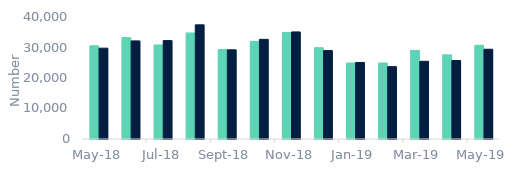
| Category | First-time
buyers | Home movers |
|---|---|---|
| 2018-05-01 | 30570 | 29780 |
| 2018-06-01 | 33260 | 32170 |
| 2018-07-01 | 30840 | 32260 |
| 2018-08-01 | 34760 | 37420 |
| 2018-09-01 | 29310 | 29230 |
| 2018-10-01 | 32020 | 32670 |
| 2018-11-01 | 34910 | 35110 |
| 2018-12-01 | 29930 | 29000 |
| 2019-01-01 | 24920 | 25090 |
| 2019-02-01 | 24920 | 23720 |
| 2019-03-01 | 29040 | 25480 |
| 2019-04-01 | 27590 | 25740 |
| 2019-05-01 | 30720 | 29430 |